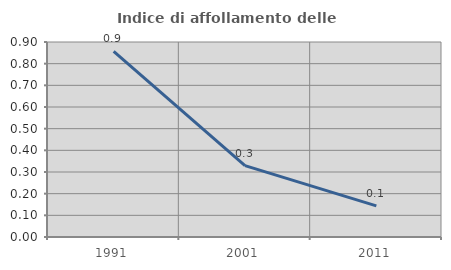
| Category | Indice di affollamento delle abitazioni  |
|---|---|
| 1991.0 | 0.857 |
| 2001.0 | 0.329 |
| 2011.0 | 0.144 |